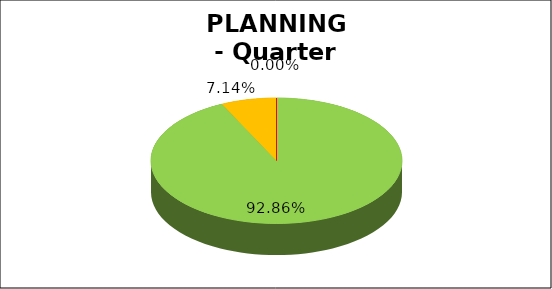
| Category | Series 0 |
|---|---|
| Green | 0.929 |
| Amber | 0.071 |
| Red | 0 |